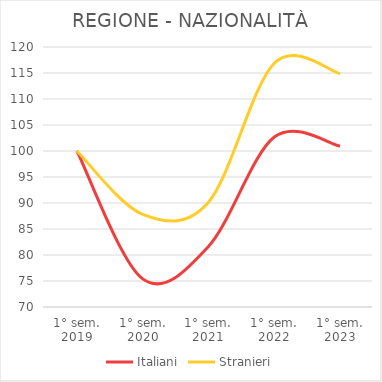
| Category | Italiani | Stranieri |
|---|---|---|
| 1° sem.
2019 | 100 | 100 |
| 1° sem.
2020 | 75.403 | 87.813 |
| 1° sem.
2021 | 81.646 | 90.145 |
| 1° sem.
2022 | 102.689 | 116.873 |
| 1° sem.
2023 | 100.957 | 114.898 |